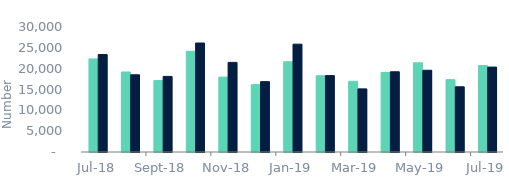
| Category | Full market | Remortgage No Equity Withdrawn |
|---|---|---|
| 2018-07-01 | 22350 | 23390 |
| 2018-08-01 | 19200 | 18530 |
| 2018-09-01 | 17140 | 18140 |
| 2018-10-01 | 24170 | 26160 |
| 2018-11-01 | 17970 | 21510 |
| 2018-12-01 | 16170 | 16880 |
| 2019-01-01 | 21660 | 25880 |
| 2019-02-01 | 18300 | 18340 |
| 2019-03-01 | 16970 | 15150 |
| 2019-04-01 | 19090 | 19260 |
| 2019-05-01 | 21400 | 19620 |
| 2019-06-01 | 17350 | 15650 |
| 2019-07-01 | 20760 | 20380 |